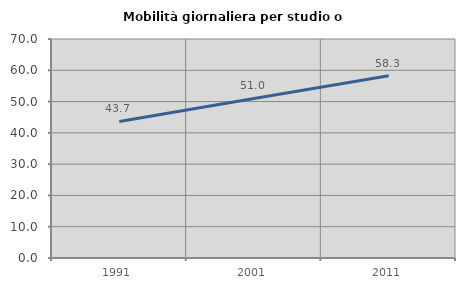
| Category | Mobilità giornaliera per studio o lavoro |
|---|---|
| 1991.0 | 43.655 |
| 2001.0 | 51.01 |
| 2011.0 | 58.252 |